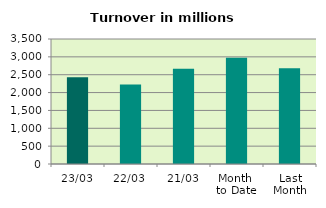
| Category | Series 0 |
|---|---|
| 23/03 | 2431.109 |
| 22/03 | 2222.956 |
| 21/03 | 2669.621 |
| Month 
to Date | 2976.206 |
| Last
Month | 2679.99 |